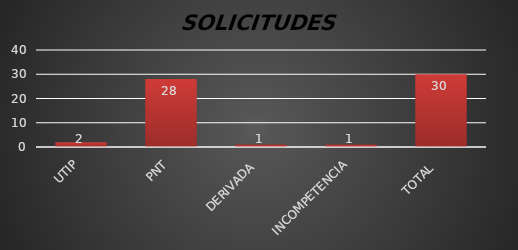
| Category | Series 1 |
|---|---|
| UTIP | 2 |
| PNT | 28 |
| DERIVADA  | 1 |
| INCOMPETENCIA | 1 |
| TOTAL  | 30 |